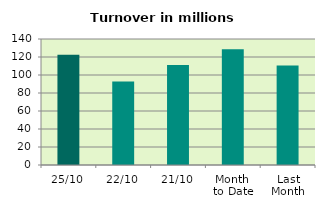
| Category | Series 0 |
|---|---|
| 25/10 | 122.509 |
| 22/10 | 92.646 |
| 21/10 | 111.039 |
| Month 
to Date | 128.472 |
| Last
Month | 110.611 |